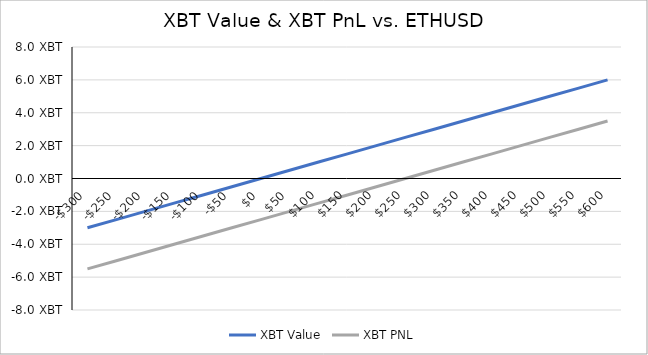
| Category | XBT Value | XBT PNL |
|---|---|---|
| -300.0 | -3 | -5.5 |
| -250.0 | -2.5 | -5 |
| -200.0 | -2 | -4.5 |
| -150.0 | -1.5 | -4 |
| -100.0 | -1 | -3.5 |
| -50.0 | -0.5 | -3 |
| 0.0 | 0 | -2.5 |
| 50.0 | 0.5 | -2 |
| 100.0 | 1 | -1.5 |
| 150.0 | 1.5 | -1 |
| 200.0 | 2 | -0.5 |
| 250.0 | 2.5 | 0 |
| 300.0 | 3 | 0.5 |
| 350.0 | 3.5 | 1 |
| 400.0 | 4 | 1.5 |
| 450.0 | 4.5 | 2 |
| 500.0 | 5 | 2.5 |
| 550.0 | 5.5 | 3 |
| 600.0 | 6 | 3.5 |